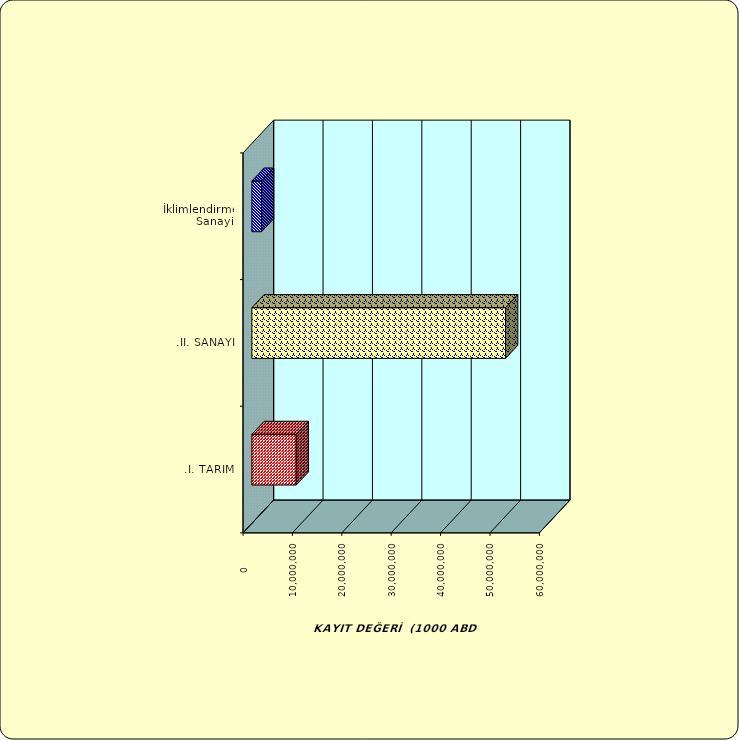
| Category | Series 0 |
|---|---|
| .I. TARIM | 8978054.337 |
| .II. SANAYİ | 51365646.568 |
|  İklimlendirme Sanayii | 1954303.487 |